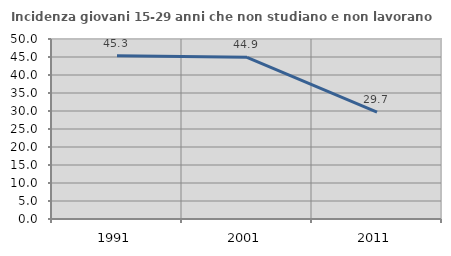
| Category | Incidenza giovani 15-29 anni che non studiano e non lavorano  |
|---|---|
| 1991.0 | 45.349 |
| 2001.0 | 44.928 |
| 2011.0 | 29.694 |